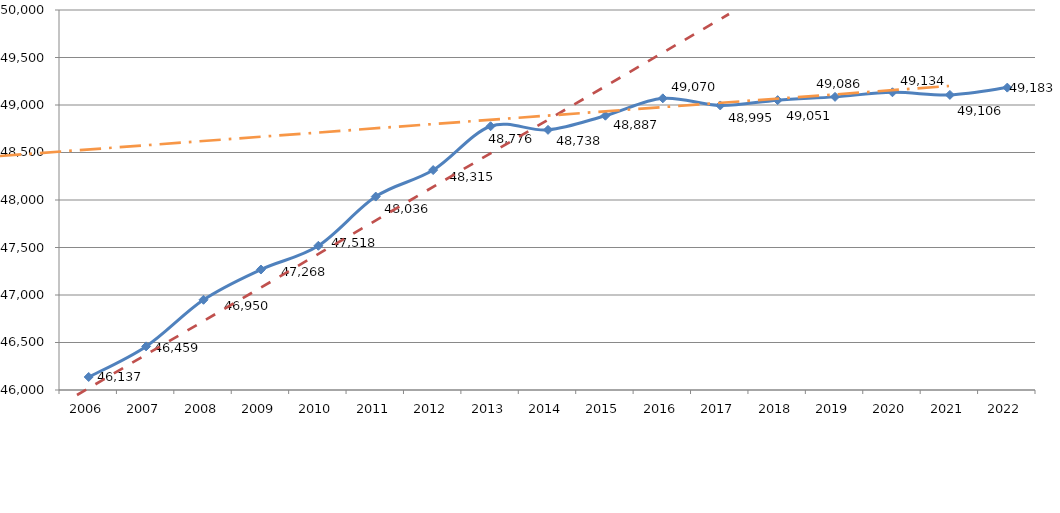
| Category | 2006 |
|---|---|
| 2006.0 | 46137.08 |
| 2007.0 | 46459.089 |
| 2008.0 | 46949.54 |
| 2009.0 | 47268.13 |
| 2010.0 | 47518.06 |
| 2011.0 | 48036.07 |
| 2012.0 | 48315.05 |
| 2013.0 | 48776.47 |
| 2014.0 | 48738.4 |
| 2015.0 | 48887.38 |
| 2016.0 | 49070.22 |
| 2017.0 | 48995.18 |
| 2018.0 | 49051.24 |
| 2019.0 | 49085.55 |
| 2020.0 | 49133.95 |
| 2021.0 | 49106.27 |
| 2022.0 | 49183.19 |